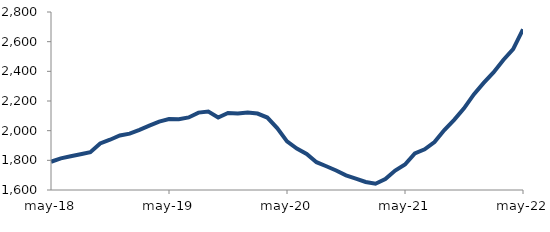
| Category | Series 0 |
|---|---|
| 2018-05-01 | 1790.506 |
| 2018-06-01 | 1813.666 |
| 2018-07-01 | 1827.546 |
| 2018-08-01 | 1840.869 |
| 2018-09-01 | 1854.761 |
| 2018-10-01 | 1913.466 |
| 2018-11-01 | 1938.846 |
| 2018-12-01 | 1967.481 |
| 2019-01-01 | 1980.122 |
| 2019-02-01 | 2005.664 |
| 2019-03-01 | 2033.637 |
| 2019-04-01 | 2060.76 |
| 2019-05-01 | 2078.07 |
| 2019-06-01 | 2076.377 |
| 2019-07-01 | 2089.152 |
| 2019-08-01 | 2121.901 |
| 2019-09-01 | 2128.491 |
| 2019-10-01 | 2088.553 |
| 2019-11-01 | 2119.211 |
| 2019-12-01 | 2116.27 |
| 2020-01-01 | 2123.179 |
| 2020-02-01 | 2115.217 |
| 2020-03-01 | 2088.6 |
| 2020-04-01 | 2017.241 |
| 2020-05-01 | 1928.116 |
| 2020-06-01 | 1878.979 |
| 2020-07-01 | 1843.29 |
| 2020-08-01 | 1787.543 |
| 2020-09-01 | 1760.281 |
| 2020-10-01 | 1731.197 |
| 2020-11-01 | 1698.835 |
| 2020-12-01 | 1677.184 |
| 2021-01-01 | 1654.072 |
| 2021-02-01 | 1641.869 |
| 2021-03-01 | 1673.821 |
| 2021-04-01 | 1730.759 |
| 2021-05-01 | 1771.425 |
| 2021-06-01 | 1846.573 |
| 2021-07-01 | 1874.111 |
| 2021-08-01 | 1922.894 |
| 2021-09-01 | 2004.225 |
| 2021-10-01 | 2073.331 |
| 2021-11-01 | 2150.314 |
| 2021-12-01 | 2244.492 |
| 2022-01-01 | 2321.95 |
| 2022-02-01 | 2392.65 |
| 2022-03-01 | 2476.383 |
| 2022-04-01 | 2549.069 |
| 2022-05-01 | 2683.336 |